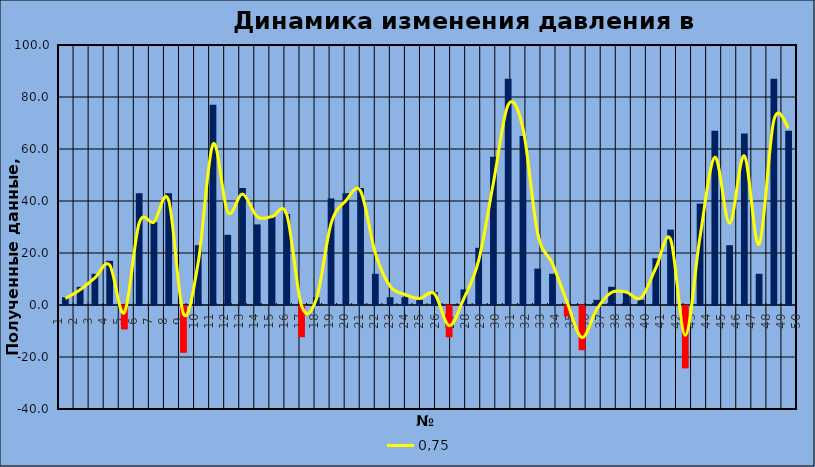
| Category | Фактическое значение |
|---|---|
| 1.0 |  |
| 2.0 |  |
| 3.0 |  |
| 4.0 |  |
| 5.0 |  |
| 6.0 |  |
| 7.0 |  |
| 8.0 |  |
| 9.0 |  |
| 10.0 |  |
| 11.0 |  |
| 12.0 |  |
| 13.0 |  |
| 14.0 |  |
| 15.0 |  |
| 16.0 |  |
| 17.0 |  |
| 18.0 |  |
| 19.0 |  |
| 20.0 |  |
| 21.0 |  |
| 22.0 |  |
| 23.0 |  |
| 24.0 |  |
| 25.0 |  |
| 26.0 |  |
| 27.0 |  |
| 28.0 |  |
| 29.0 |  |
| 30.0 |  |
| 31.0 |  |
| 32.0 |  |
| 33.0 |  |
| 34.0 |  |
| 35.0 |  |
| 36.0 |  |
| 37.0 |  |
| 38.0 |  |
| 39.0 |  |
| 40.0 |  |
| 41.0 |  |
| 42.0 |  |
| 43.0 |  |
| 44.0 |  |
| 45.0 |  |
| 46.0 |  |
| 47.0 |  |
| 48.0 |  |
| 49.0 |  |
| 50.0 |  |